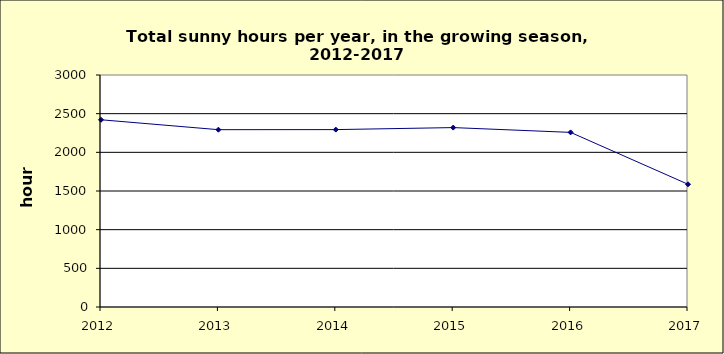
| Category | Series 0 |
|---|---|
| 2012.0 | 2421 |
| 2013.0 | 2293 |
| 2014.0 | 2294 |
| 2015.0 | 2320 |
| 2016.0 | 2258 |
| 2017.0 | 1587 |